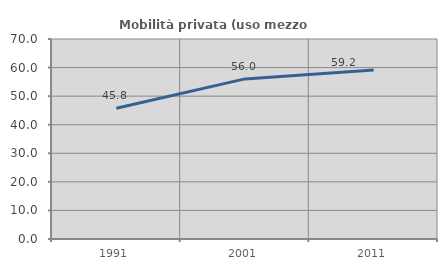
| Category | Mobilità privata (uso mezzo privato) |
|---|---|
| 1991.0 | 45.766 |
| 2001.0 | 56.033 |
| 2011.0 | 59.184 |